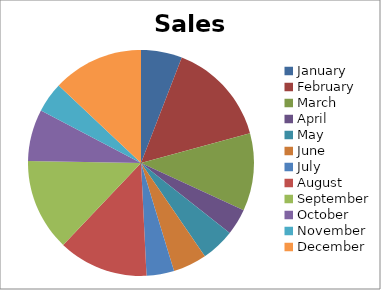
| Category | Sales |
|---|---|
| January | 310 |
| February | 785 |
| March | 586 |
| April | 198 |
| May | 254 |
| June | 255 |
| July | 208 |
| August | 679 |
| September | 696 |
| October | 390 |
| November | 228 |
| December | 685 |